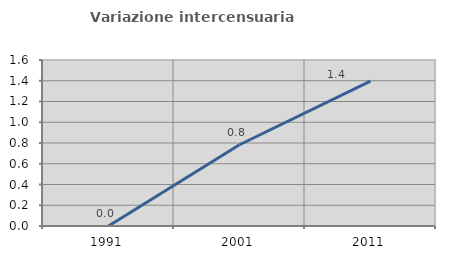
| Category | Variazione intercensuaria annua |
|---|---|
| 1991.0 | 0 |
| 2001.0 | 0.783 |
| 2011.0 | 1.396 |